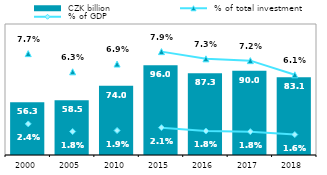
| Category |  CZK billion |
|---|---|
| 2000 | 56.326 |
| 2005 | 58.518 |
| 2010 | 74.018 |
| 2015 | 95.977 |
| 2016 | 87.256 |
| 2017 | 90.047 |
| 2018 | 83.149 |